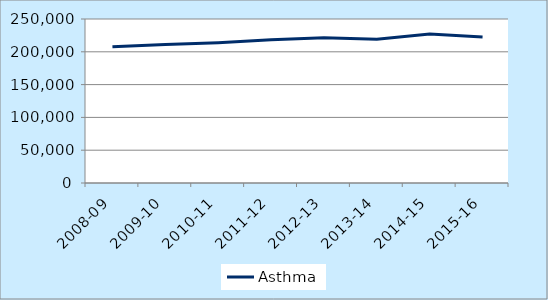
| Category | Asthma |
|---|---|
| 2008-09 | 207513 |
| 2009-10 | 210952 |
| 2010-11 | 213752 |
| 2011-12 | 218243 |
| 2012-13 | 221356 |
| 2013-14 | 219238 |
| 2014-15 | 227075 |
| 2015-16 | 222590 |